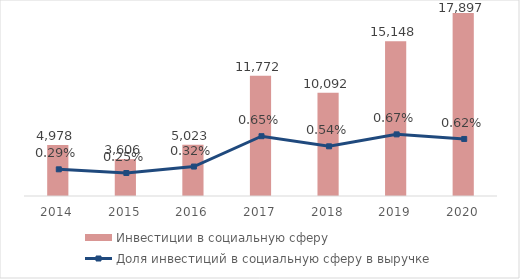
| Category | Инвестиции в социальную сферу |
|---|---|
| 2014.0 | 4978 |
| 2015.0 | 3606 |
| 2016.0 | 5023 |
| 2017.0 | 11772 |
| 2018.0 | 10092.129 |
| 2019.0 | 15148.373 |
| 2020.0 | 17897.476 |